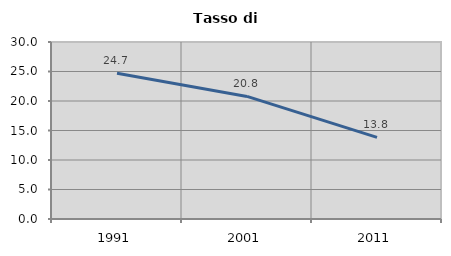
| Category | Tasso di disoccupazione   |
|---|---|
| 1991.0 | 24.714 |
| 2001.0 | 20.775 |
| 2011.0 | 13.825 |